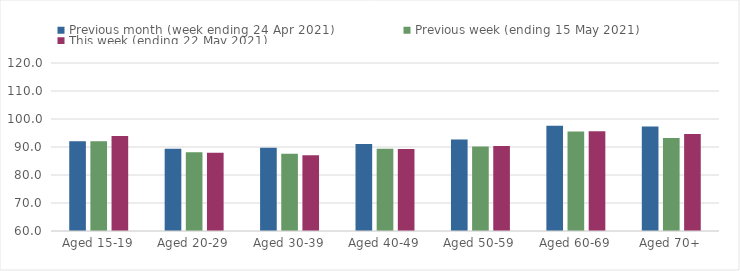
| Category | Previous month (week ending 24 Apr 2021) | Previous week (ending 15 May 2021) | This week (ending 22 May 2021) |
|---|---|---|---|
| Aged 15-19 | 92.04 | 92.01 | 93.89 |
| Aged 20-29 | 89.4 | 88.15 | 87.94 |
| Aged 30-39 | 89.74 | 87.59 | 87.08 |
| Aged 40-49 | 91.07 | 89.38 | 89.32 |
| Aged 50-59 | 92.71 | 90.18 | 90.34 |
| Aged 60-69 | 97.55 | 95.57 | 95.64 |
| Aged 70+ | 97.3 | 93.25 | 94.66 |